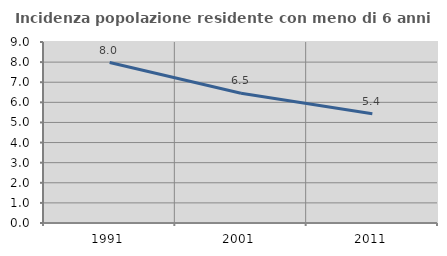
| Category | Incidenza popolazione residente con meno di 6 anni |
|---|---|
| 1991.0 | 7.98 |
| 2001.0 | 6.455 |
| 2011.0 | 5.429 |